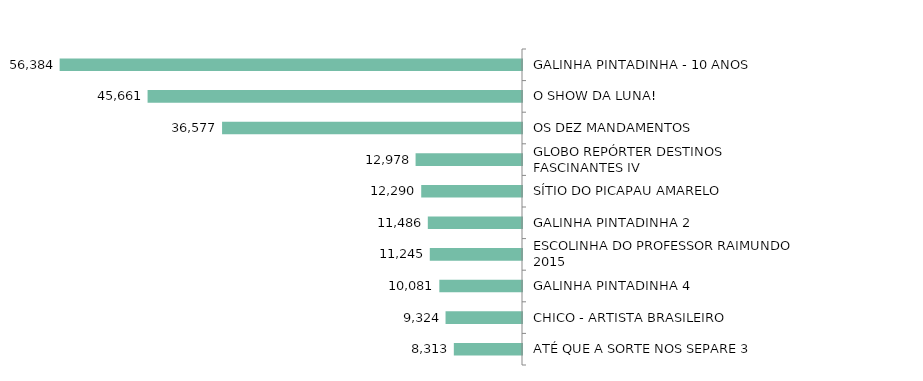
| Category | Series 0 |
|---|---|
| GALINHA PINTADINHA - 10 ANOS | 56384 |
| O SHOW DA LUNA! | 45661 |
| OS DEZ MANDAMENTOS | 36577 |
| GLOBO REPÓRTER DESTINOS FASCINANTES IV | 12978 |
| SÍTIO DO PICAPAU AMARELO | 12290 |
| GALINHA PINTADINHA 2 | 11486 |
| ESCOLINHA DO PROFESSOR RAIMUNDO 2015 | 11245 |
| GALINHA PINTADINHA 4 | 10081 |
| CHICO - ARTISTA BRASILEIRO | 9324 |
| ATÉ QUE A SORTE NOS SEPARE 3 | 8313 |